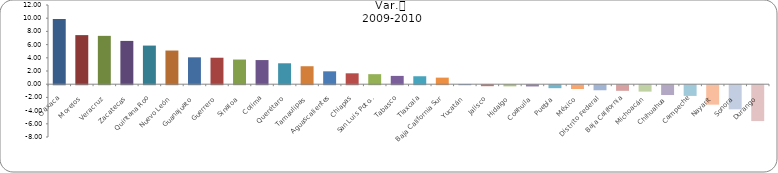
| Category | Var.
 2010-2011 |
|---|---|
| Oaxaca | 9.865 |
| Morelos | 7.437 |
| Veracruz | 7.325 |
| Zacatecas | 6.558 |
| Quintana Roo | 5.852 |
| Nuevo León | 5.101 |
| Guanajuato | 4.073 |
| Guerrero | 4.011 |
| Sinaloa | 3.736 |
| Colima | 3.657 |
| Querétaro | 3.168 |
| Tamaulipas | 2.723 |
| Aguascalientes | 1.952 |
| Chiapas | 1.651 |
| San Luis Potosí | 1.521 |
| Tabasco | 1.258 |
| Tlaxcala | 1.205 |
| Baja California Sur | 0.995 |
| Yucatán | -0.002 |
| Jalisco | -0.15 |
| Hidalgo | -0.172 |
| Coahuila | -0.191 |
| Puebla | -0.452 |
| México | -0.578 |
| Distrito Federal | -0.766 |
| Baja California | -0.853 |
| Michoacán | -0.972 |
| Chihuahua | -1.49 |
| Campeche | -1.623 |
| Nayarit | -2.948 |
| Sonora | -3.652 |
| Durango | -5.436 |